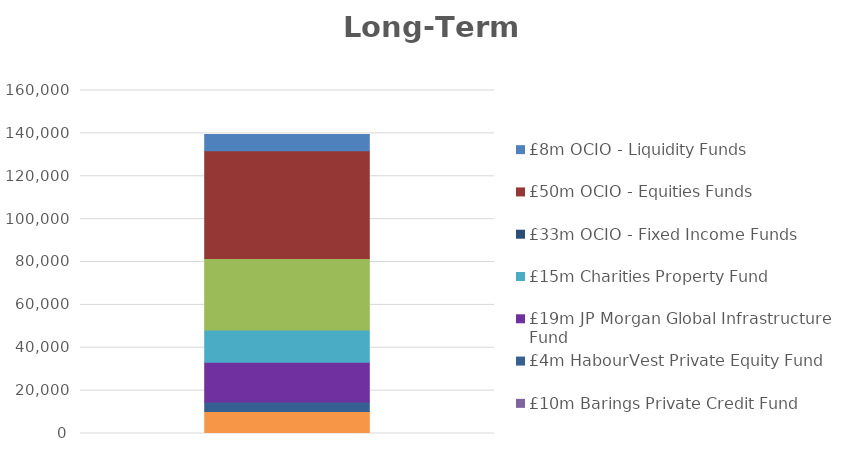
| Category | £10m Barings Private Credit Fund | £4m HabourVest Private Equity Fund | £19m JP Morgan Global Infrastructure Fund | £15m Charities Property Fund  | £33m OCIO - Fixed Income Funds | £50m OCIO - Equities Funds | £8m OCIO - Liquidity Funds |
|---|---|---|---|---|---|---|---|
| 0 | 10227 | 4498 | 18501 | 15027 | 33393 | 50280 | 7560 |